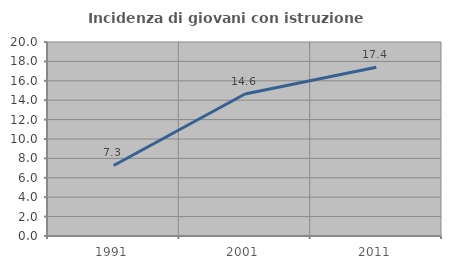
| Category | Incidenza di giovani con istruzione universitaria |
|---|---|
| 1991.0 | 7.273 |
| 2001.0 | 14.634 |
| 2011.0 | 17.391 |